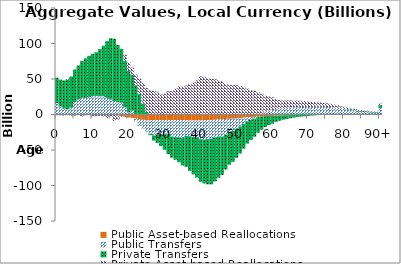
| Category | Public Asset-based Reallocations | Public Transfers | Private Transfers | Private Asset-based Reallocations |
|---|---|---|---|---|
| 0 | -152.953 | 16178.209 | 35751.461 | -817.573 |
|  | -161.435 | 11460 | 37716.312 | -1067.041 |
| 2 | -168.386 | 8367.373 | 39720.947 | -1201.225 |
| 3 | -176.44 | 7334.604 | 41975.771 | 999.636 |
| 4 | -183.617 | 9491.277 | 44111.616 | -1430.826 |
| 5 | -190.659 | 17546.677 | 45813.739 | -1455.627 |
| 6 | -198.529 | 21285.037 | 47883.233 | -379.232 |
| 7 | -213.535 | 23385.773 | 52155.057 | -2703.467 |
| 8 | -223.544 | 23381.704 | 55840.398 | -938.427 |
| 9 | -226.698 | 24830.636 | 57887.775 | -641.262 |
| 10 | -231.958 | 26037.123 | 59434.502 | -2661.019 |
| 11 | -242.172 | 26114.797 | 61644.762 | -2054.698 |
| 12 | -377.757 | 25704.128 | 66459.458 | -1719.661 |
| 13 | -460.508 | 25843.816 | 71029.024 | -2197.69 |
| 14 | -568 | 23418.791 | 79958.477 | -4407.092 |
| 15 | -720.463 | 21345.015 | 86058.56 | -3018.565 |
| 16 | -946.429 | 19113.334 | 87595.316 | -8128.671 |
| 17 | -1326.304 | 17263.988 | 80676.763 | -6242.557 |
| 18 | -2212.925 | 16823.888 | 75621.36 | -1585.802 |
| 19 | -3290.955 | 10103.036 | 65724.105 | 8355.622 |
| 20 | -4148.984 | 2804.248 | 58396.774 | 11879.476 |
| 21 | -4784.221 | 5407.552 | 50043.711 | 10703.011 |
| 22 | -5603.106 | -3279.636 | 41290.277 | 15024.881 |
| 23 | -6635.536 | -9688.497 | 28952.477 | 21822.646 |
| 24 | -7429.8 | -12328.848 | 15261.841 | 29290.062 |
| 25 | -7934.937 | -16167.328 | 3508.956 | 34156.348 |
| 26 | -8221.321 | -19237.829 | -1636.969 | 34365.051 |
| 27 | -8168.743 | -21540.204 | -7008.365 | 33533.437 |
| 28 | -7926.837 | -19665.776 | -12419.261 | 32203.348 |
| 29 | -7806.936 | -19817.683 | -16929.493 | 28182.473 |
| 30 | -7712.112 | -19319.23 | -22761.441 | 29514.99 |
| 31 | -7685.043 | -19532.157 | -28530.448 | 32958.366 |
| 32 | -7705.883 | -23241.032 | -29920.655 | 32988.511 |
| 33 | -7755.51 | -24082.518 | -31880.312 | 36067.171 |
| 34 | -7897.433 | -24222.705 | -35082.41 | 39703.009 |
| 35 | -8091.512 | -25317.891 | -38354.671 | 39389.913 |
| 36 | -8297.768 | -21911.597 | -43363.418 | 40829.355 |
| 37 | -8447.544 | -22114.776 | -48807.774 | 42499.386 |
| 38 | -8507.555 | -23321.368 | -52475.279 | 44828.109 |
| 39 | -8480.939 | -23867.762 | -56460.228 | 48709.462 |
| 40 | -8468.236 | -26287.583 | -60033.183 | 53569.889 |
| 41 | -8218.021 | -26839.934 | -61984.884 | 53176.759 |
| 42 | -7881.101 | -26734.999 | -63707.362 | 50911.907 |
| 43 | -7655.534 | -26406.462 | -64340.155 | 50308.649 |
| 44 | -7378.019 | -24697.029 | -62187.603 | 49770.067 |
| 45 | -7052.555 | -23864.289 | -58125.705 | 48466.701 |
| 46 | -6781.308 | -24309.366 | -53943.013 | 46963.479 |
| 47 | -6426.645 | -21874.724 | -49095.515 | 43313.17 |
| 48 | -6102.312 | -18957.275 | -45681.503 | 41719.461 |
| 49 | -5763.285 | -17444.334 | -43463.634 | 41502.806 |
| 50 | -5400.988 | -14730.083 | -40838.564 | 41278.098 |
| 51 | -4984.134 | -12097.667 | -37838.362 | 40094.362 |
| 52 | -4526.149 | -8567.779 | -35004.413 | 38350.61 |
| 53 | -4053.446 | -5434.576 | -31546.454 | 36533.675 |
| 54 | -3682.441 | -3994.612 | -28140.283 | 34176.93 |
| 55 | -3392.104 | -2575.501 | -25273.811 | 33777.255 |
| 56 | -3022.945 | -779.814 | -21708.695 | 31437.765 |
| 57 | -2675.3 | 929.361 | -18603.343 | 28408.271 |
| 58 | -2289.203 | 3296.766 | -15308.91 | 23211.628 |
| 59 | -1985.239 | 5114.894 | -12891.168 | 20200.201 |
| 60 | -1721.402 | 6134.304 | -11149.156 | 18060.13 |
| 61 | -1449.378 | 6990.211 | -8911.518 | 14680.187 |
| 62 | -1229.116 | 7666.464 | -7505.975 | 12887.921 |
| 63 | -1069.802 | 8382.187 | -6263.379 | 11367.423 |
| 64 | -950.654 | 9067.971 | -5331.761 | 10613.269 |
| 65 | -844.217 | 9568.475 | -4464.06 | 10214.166 |
| 66 | -719.672 | 10164.161 | -3532.184 | 9078.918 |
| 67 | -645.163 | 10361.639 | -2904.069 | 9031.488 |
| 68 | -572.432 | 10550.671 | -2500.575 | 8857.402 |
| 69 | -487.521 | 10688.449 | -2058.754 | 8227.531 |
| 70 | -401.746 | 10710.762 | -1656.128 | 7678.591 |
| 71 | -321.066 | 10796.815 | -1252.215 | 7081.868 |
| 72 | -272.937 | 10949.093 | -887.985 | 6745.307 |
| 73 | -224.42 | 10969.912 | -523.511 | 6128.018 |
| 74 | -189.739 | 10707.927 | -351.096 | 5603.642 |
| 75 | -167.604 | 10567.879 | -173.449 | 5224.619 |
| 76 | -146.699 | 10360.686 | -39.999 | 4773.934 |
| 77 | -124.295 | 9867.745 | 98.466 | 4165.907 |
| 78 | -106.792 | 9065.119 | 242.644 | 3665.029 |
| 79 | -89.367 | 8109.393 | 417.029 | 3147.167 |
| 80 | -77.091 | 7306.575 | 638.136 | 2784.713 |
| 81 | -65.823 | 6523.389 | 808.706 | 2407.238 |
| 82 | -55.483 | 5810.78 | 929.042 | 2067.008 |
| 83 | -44.753 | 4941.659 | 976.245 | 1704.971 |
| 84 | -35.296 | 4118.582 | 972.06 | 1377.426 |
| 85 | -30.671 | 3796.249 | 1039.44 | 1228.509 |
| 86 | -26.89 | 3483.381 | 1093.584 | 1098.411 |
| 87 | -22.616 | 3065.354 | 1084.153 | 905.402 |
| 88 | -18.703 | 2675.103 | 1056.963 | 752.454 |
| 89 | -14.927 | 2209.52 | 970.366 | 572.883 |
| 90+ | -59.256 | 8793.383 | 4357.602 | 2143.741 |